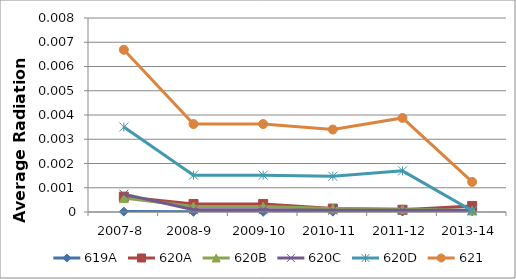
| Category | 619A | 620A | 620B | 620C | 620D | 621 |
|---|---|---|---|---|---|---|
| 2007-8 | 0 | 0.001 | 0.001 | 0.001 | 0.004 | 0.007 |
| 2008-9 | 0 | 0 | 0 | 0 | 0.002 | 0.004 |
| 2009-10 | 0 | 0 | 0 | 0 | 0.002 | 0.004 |
| 2010-11 | 0 | 0 | 0 | 0 | 0.001 | 0.003 |
| 2011-12 | 0 | 0 | 0 | 0 | 0.002 | 0.004 |
| 2013-14 | 0 | 0 | 0 | 0 | 0 | 0.001 |